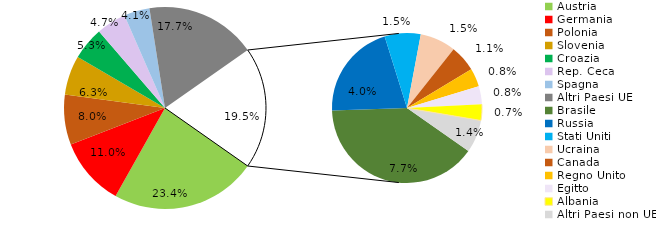
| Category | Series 0 |
|---|---|
| Austria | 23.398 |
| Germania | 10.995 |
| Polonia | 8.022 |
| Slovenia | 6.251 |
| Croazia | 5.277 |
| Rep. Ceca | 4.745 |
| Spagna | 4.11 |
| Altri Paesi UE | 17.728 |
| Brasile | 7.738 |
| Russia | 4.033 |
| Stati Uniti | 1.512 |
| Ucraina | 1.504 |
| Canada | 1.113 |
| Regno Unito | 0.766 |
| Egitto | 0.761 |
| Albania | 0.67 |
| Altri Paesi non UE | 1.377 |